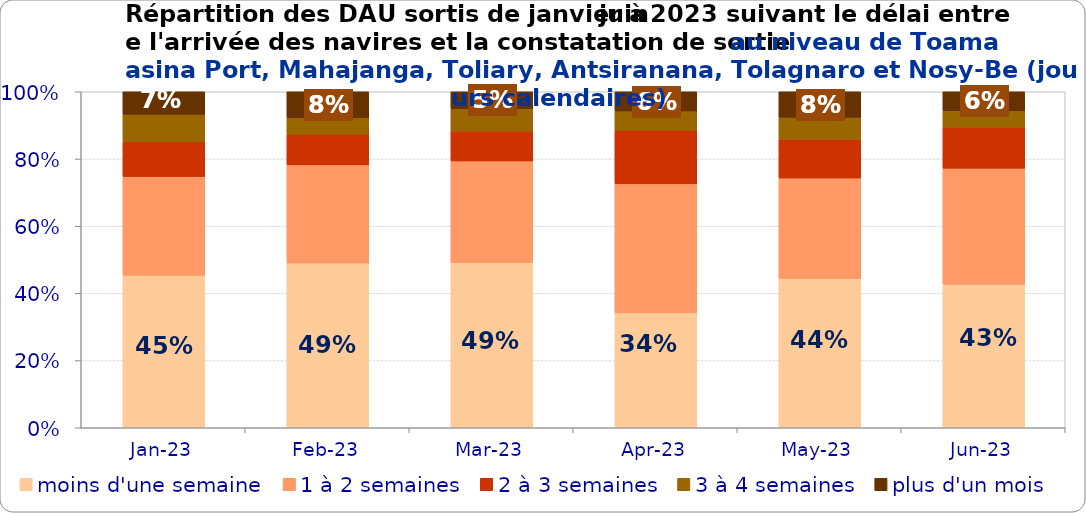
| Category | moins d'une semaine | 1 à 2 semaines | 2 à 3 semaines | 3 à 4 semaines | plus d'un mois |
|---|---|---|---|---|---|
| 2023-01-01 | 0.454 | 0.294 | 0.104 | 0.081 | 0.067 |
| 2023-02-01 | 0.49 | 0.292 | 0.092 | 0.048 | 0.078 |
| 2023-03-01 | 0.492 | 0.303 | 0.089 | 0.066 | 0.051 |
| 2023-04-01 | 0.342 | 0.384 | 0.16 | 0.057 | 0.057 |
| 2023-05-01 | 0.444 | 0.299 | 0.115 | 0.066 | 0.076 |
| 2023-06-01 | 0.427 | 0.346 | 0.122 | 0.049 | 0.056 |